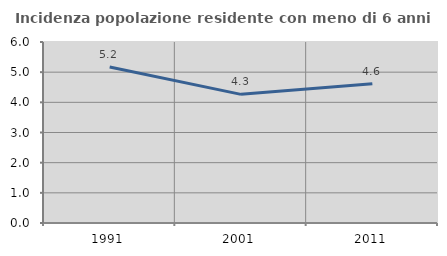
| Category | Incidenza popolazione residente con meno di 6 anni |
|---|---|
| 1991.0 | 5.173 |
| 2001.0 | 4.264 |
| 2011.0 | 4.616 |